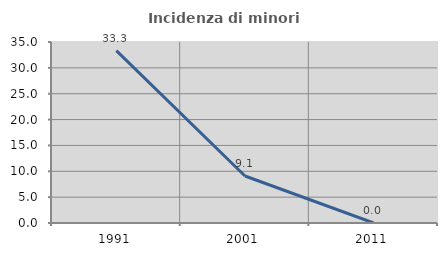
| Category | Incidenza di minori stranieri |
|---|---|
| 1991.0 | 33.333 |
| 2001.0 | 9.091 |
| 2011.0 | 0 |